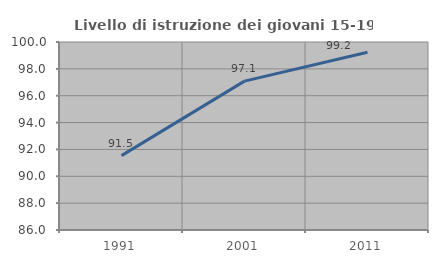
| Category | Livello di istruzione dei giovani 15-19 anni |
|---|---|
| 1991.0 | 91.538 |
| 2001.0 | 97.087 |
| 2011.0 | 99.231 |